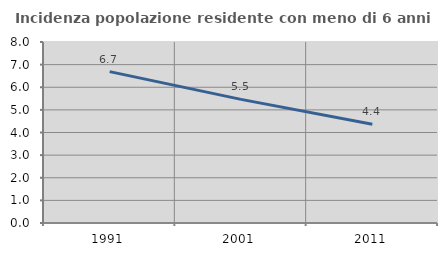
| Category | Incidenza popolazione residente con meno di 6 anni |
|---|---|
| 1991.0 | 6.69 |
| 2001.0 | 5.463 |
| 2011.0 | 4.366 |